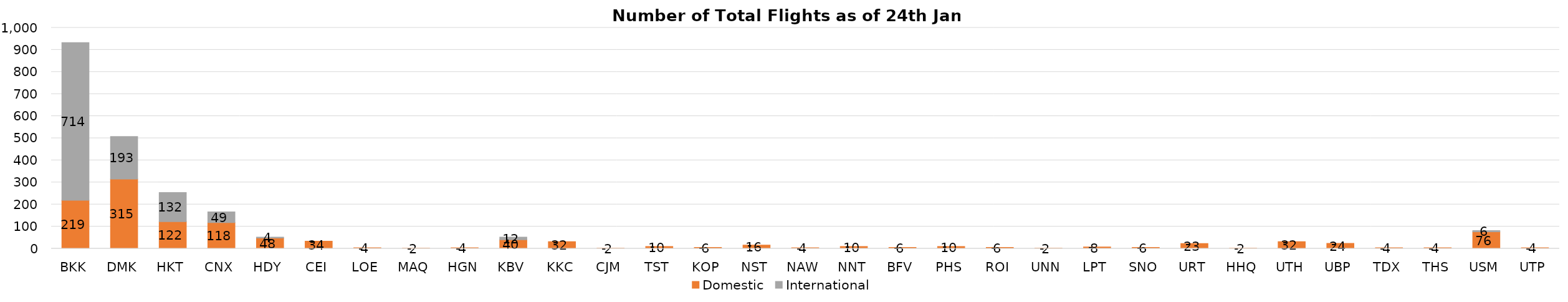
| Category | Domestic | International |
|---|---|---|
| BKK | 219 | 714 |
| DMK | 315 | 193 |
| HKT | 122 | 132 |
| CNX | 118 | 49 |
| HDY | 48 | 4 |
| CEI | 34 | 0 |
| LOE | 4 | 0 |
| MAQ | 2 | 0 |
| HGN | 4 | 0 |
| KBV | 40 | 12 |
| KKC | 32 | 0 |
| CJM | 2 | 0 |
| TST | 10 | 0 |
| KOP | 6 | 0 |
| NST | 16 | 0 |
| NAW | 4 | 0 |
| NNT | 10 | 0 |
| BFV | 6 | 0 |
| PHS | 10 | 0 |
| ROI | 6 | 0 |
| UNN | 2 | 0 |
| LPT | 8 | 0 |
| SNO | 6 | 0 |
| URT | 23 | 0 |
| HHQ | 2 | 0 |
| UTH | 32 | 0 |
| UBP | 24 | 0 |
| TDX | 4 | 0 |
| THS | 4 | 0 |
| USM | 76 | 6 |
| UTP | 4 | 0 |